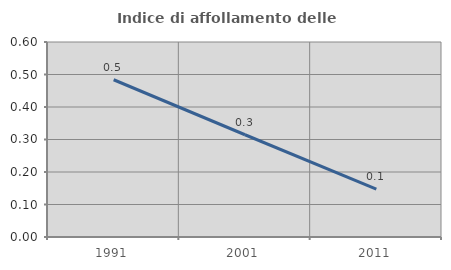
| Category | Indice di affollamento delle abitazioni  |
|---|---|
| 1991.0 | 0.484 |
| 2001.0 | 0.315 |
| 2011.0 | 0.147 |